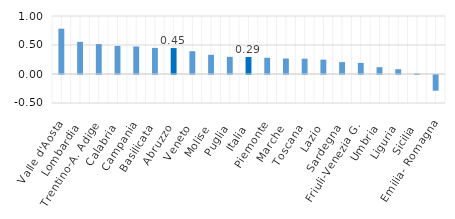
| Category | Series 0 |
|---|---|
| Valle d'Aosta | 0.781 |
| Lombardia | 0.554 |
| Trentino-A. Adige | 0.516 |
| Calabria | 0.484 |
| Campania | 0.474 |
| Basilicata | 0.45 |
| Abruzzo | 0.447 |
| Veneto | 0.393 |
| Molise | 0.332 |
| Puglia | 0.295 |
| Italia | 0.293 |
| Piemonte | 0.28 |
| Marche | 0.267 |
| Toscana | 0.263 |
| Lazio | 0.247 |
| Sardegna | 0.205 |
| Friuli-Venezia G. | 0.192 |
| Umbria | 0.117 |
| Liguria | 0.082 |
| Sicilia | 0.008 |
| Emilia- Romagna | -0.271 |